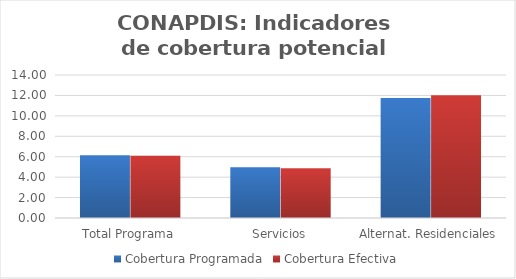
| Category | Cobertura Programada | Cobertura Efectiva |
|---|---|---|
| Total Programa | 6.132 | 6.086 |
| Servicios | 4.977 | 4.865 |
| Alternat. Residenciales | 11.742 | 12.014 |